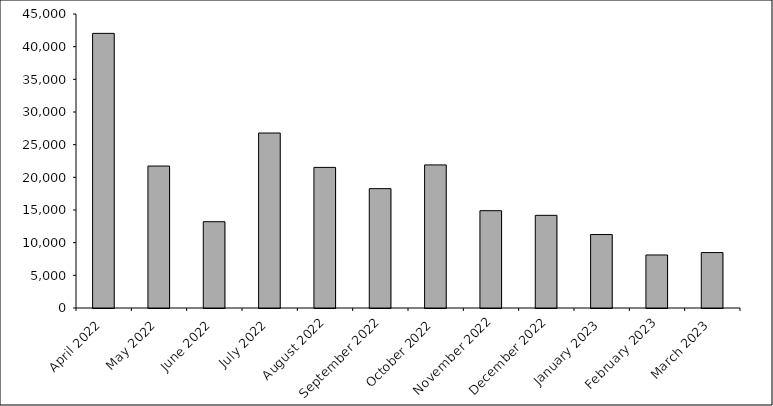
| Category | Series 0 |
|---|---|
| April 2022 | 42033 |
| May 2022 | 21728 |
| June 2022 | 13211 |
| July 2022 | 26781 |
| August 2022 | 21521 |
| September 2022 | 18269 |
| October 2022 | 21900 |
| November 2022 | 14897 |
| December 2022 | 14183 |
| January 2023 | 11246 |
| February 2023 | 8116 |
| March 2023 | 8484 |